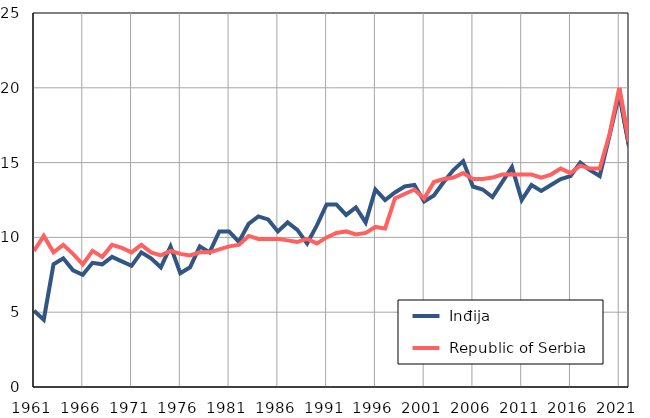
| Category |  Inđija |  Republic of Serbia |
|---|---|---|
| 1961.0 | 5.1 | 9.1 |
| 1962.0 | 4.5 | 10.1 |
| 1963.0 | 8.2 | 9 |
| 1964.0 | 8.6 | 9.5 |
| 1965.0 | 7.8 | 8.9 |
| 1966.0 | 7.5 | 8.2 |
| 1967.0 | 8.3 | 9.1 |
| 1968.0 | 8.2 | 8.7 |
| 1969.0 | 8.7 | 9.5 |
| 1970.0 | 8.4 | 9.3 |
| 1971.0 | 8.1 | 9 |
| 1972.0 | 9 | 9.5 |
| 1973.0 | 8.6 | 9 |
| 1974.0 | 8 | 8.8 |
| 1975.0 | 9.4 | 9.1 |
| 1976.0 | 7.6 | 8.9 |
| 1977.0 | 8 | 8.8 |
| 1978.0 | 9.4 | 9 |
| 1979.0 | 9 | 9 |
| 1980.0 | 10.4 | 9.2 |
| 1981.0 | 10.4 | 9.4 |
| 1982.0 | 9.7 | 9.5 |
| 1983.0 | 10.9 | 10.1 |
| 1984.0 | 11.4 | 9.9 |
| 1985.0 | 11.2 | 9.9 |
| 1986.0 | 10.4 | 9.9 |
| 1987.0 | 11 | 9.8 |
| 1988.0 | 10.5 | 9.7 |
| 1989.0 | 9.6 | 9.9 |
| 1990.0 | 10.8 | 9.6 |
| 1991.0 | 12.2 | 10 |
| 1992.0 | 12.2 | 10.3 |
| 1993.0 | 11.5 | 10.4 |
| 1994.0 | 12 | 10.2 |
| 1995.0 | 11 | 10.3 |
| 1996.0 | 13.2 | 10.7 |
| 1997.0 | 12.5 | 10.6 |
| 1998.0 | 13 | 12.6 |
| 1999.0 | 13.4 | 12.9 |
| 2000.0 | 13.5 | 13.2 |
| 2001.0 | 12.4 | 12.6 |
| 2002.0 | 12.8 | 13.7 |
| 2003.0 | 13.7 | 13.9 |
| 2004.0 | 14.5 | 14 |
| 2005.0 | 15.1 | 14.3 |
| 2006.0 | 13.4 | 13.9 |
| 2007.0 | 13.2 | 13.9 |
| 2008.0 | 12.7 | 14 |
| 2009.0 | 13.7 | 14.2 |
| 2010.0 | 14.7 | 14.2 |
| 2011.0 | 12.5 | 14.2 |
| 2012.0 | 13.5 | 14.2 |
| 2013.0 | 13.1 | 14 |
| 2014.0 | 13.5 | 14.2 |
| 2015.0 | 13.9 | 14.6 |
| 2016.0 | 14.1 | 14.3 |
| 2017.0 | 15 | 14.8 |
| 2018.0 | 14.5 | 14.6 |
| 2019.0 | 14.1 | 14.6 |
| 2020.0 | 16.8 | 16.9 |
| 2021.0 | 19.6 | 20 |
| 2022.0 | 16.1 | 16.4 |